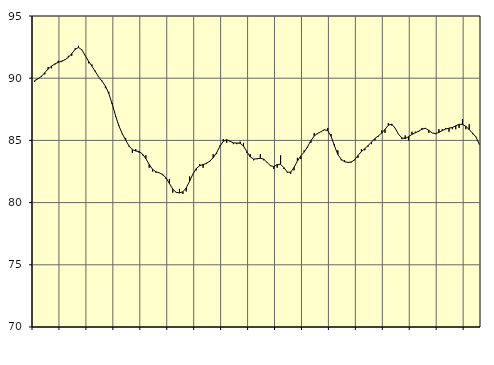
| Category | Piggar | Series 1 |
|---|---|---|
| nan | 89.7 | 89.81 |
| 87.0 | 90 | 89.95 |
| 87.0 | 90.1 | 90.15 |
| 87.0 | 90.3 | 90.44 |
| nan | 90.9 | 90.74 |
| 88.0 | 90.8 | 90.97 |
| 88.0 | 91.1 | 91.15 |
| 88.0 | 91.4 | 91.27 |
| nan | 91.3 | 91.37 |
| 89.0 | 91.5 | 91.48 |
| 89.0 | 91.8 | 91.68 |
| 89.0 | 91.8 | 91.98 |
| nan | 92.4 | 92.31 |
| 90.0 | 92.6 | 92.47 |
| 90.0 | 92.3 | 92.28 |
| 90.0 | 91.8 | 91.82 |
| nan | 91.2 | 91.36 |
| 91.0 | 91.1 | 90.96 |
| 91.0 | 90.6 | 90.53 |
| 91.0 | 90.1 | 90.1 |
| nan | 89.8 | 89.75 |
| 92.0 | 89.2 | 89.37 |
| 92.0 | 88.9 | 88.77 |
| 92.0 | 88 | 87.93 |
| nan | 86.9 | 87 |
| 93.0 | 86.2 | 86.16 |
| 93.0 | 85.5 | 85.54 |
| 93.0 | 85.2 | 85.03 |
| nan | 84.5 | 84.56 |
| 94.0 | 84 | 84.26 |
| 94.0 | 84.3 | 84.15 |
| 94.0 | 84 | 84.1 |
| nan | 83.8 | 83.91 |
| 95.0 | 83.8 | 83.53 |
| 95.0 | 82.8 | 83.07 |
| 95.0 | 82.5 | 82.67 |
| nan | 82.4 | 82.48 |
| 96.0 | 82.4 | 82.39 |
| 96.0 | 82.2 | 82.26 |
| 96.0 | 81.9 | 81.99 |
| nan | 81.9 | 81.54 |
| 97.0 | 80.8 | 81.08 |
| 97.0 | 80.8 | 80.83 |
| 97.0 | 81.1 | 80.78 |
| nan | 80.7 | 80.87 |
| 98.0 | 80.9 | 81.18 |
| 98.0 | 82.1 | 81.73 |
| 98.0 | 82.3 | 82.31 |
| nan | 82.6 | 82.74 |
| 99.0 | 83.1 | 82.97 |
| 99.0 | 82.8 | 83.06 |
| 99.0 | 83.2 | 83.15 |
| nan | 83.3 | 83.34 |
| 0.0 | 83.9 | 83.6 |
| 0.0 | 83.9 | 84.01 |
| 0.0 | 84.6 | 84.53 |
| nan | 85.1 | 84.93 |
| 1.0 | 84.8 | 85.05 |
| 1.0 | 84.9 | 84.93 |
| 1.0 | 84.7 | 84.8 |
| nan | 84.7 | 84.79 |
| 2.0 | 84.9 | 84.77 |
| 2.0 | 84.8 | 84.54 |
| 2.0 | 84 | 84.1 |
| nan | 83.9 | 83.67 |
| 3.0 | 83.4 | 83.5 |
| 3.0 | 83.5 | 83.52 |
| 3.0 | 83.9 | 83.57 |
| nan | 83.4 | 83.49 |
| 4.0 | 83.2 | 83.23 |
| 4.0 | 83 | 82.96 |
| 4.0 | 82.7 | 82.9 |
| nan | 82.8 | 83.05 |
| 5.0 | 83.8 | 83.08 |
| 5.0 | 82.7 | 82.81 |
| 5.0 | 82.4 | 82.45 |
| nan | 82.3 | 82.44 |
| 6.0 | 82.6 | 82.83 |
| 6.0 | 83.6 | 83.34 |
| 6.0 | 83.5 | 83.75 |
| nan | 84.2 | 84.06 |
| 7.0 | 84.4 | 84.48 |
| 7.0 | 84.8 | 84.98 |
| 7.0 | 85.6 | 85.36 |
| nan | 85.5 | 85.56 |
| 8.0 | 85.7 | 85.7 |
| 8.0 | 85.9 | 85.85 |
| 8.0 | 86 | 85.79 |
| nan | 85.5 | 85.32 |
| 9.0 | 84.7 | 84.55 |
| 9.0 | 84.2 | 83.87 |
| 9.0 | 83.4 | 83.48 |
| nan | 83.4 | 83.29 |
| 10.0 | 83.2 | 83.23 |
| 10.0 | 83.3 | 83.25 |
| 10.0 | 83.4 | 83.45 |
| nan | 83.6 | 83.79 |
| 11.0 | 84.3 | 84.1 |
| 11.0 | 84.2 | 84.34 |
| 11.0 | 84.5 | 84.59 |
| nan | 84.7 | 84.87 |
| 12.0 | 85 | 85.15 |
| 12.0 | 85.3 | 85.36 |
| 12.0 | 85.8 | 85.58 |
| nan | 85.6 | 85.89 |
| 13.0 | 86.4 | 86.22 |
| 13.0 | 86.2 | 86.31 |
| 13.0 | 86 | 85.99 |
| nan | 85.5 | 85.5 |
| 14.0 | 85.1 | 85.2 |
| 14.0 | 85.4 | 85.15 |
| 14.0 | 85 | 85.3 |
| nan | 85.7 | 85.48 |
| 15.0 | 85.7 | 85.61 |
| 15.0 | 85.7 | 85.74 |
| 15.0 | 86 | 85.9 |
| nan | 86 | 85.97 |
| 16.0 | 85.6 | 85.81 |
| 16.0 | 85.6 | 85.6 |
| 16.0 | 85.5 | 85.55 |
| nan | 85.9 | 85.64 |
| 17.0 | 85.9 | 85.79 |
| 17.0 | 86 | 85.91 |
| 17.0 | 85.7 | 85.98 |
| nan | 85.9 | 86.04 |
| 18.0 | 85.9 | 86.17 |
| 18.0 | 86 | 86.29 |
| 18.0 | 86.7 | 86.29 |
| nan | 85.9 | 86.13 |
| 19.0 | 86.3 | 85.87 |
| 19.0 | 85.5 | 85.58 |
| 19.0 | 85.3 | 85.28 |
| nan | 84.7 | 84.68 |